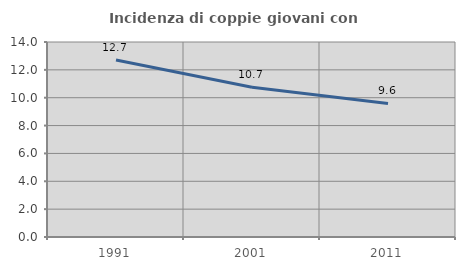
| Category | Incidenza di coppie giovani con figli |
|---|---|
| 1991.0 | 12.713 |
| 2001.0 | 10.746 |
| 2011.0 | 9.592 |